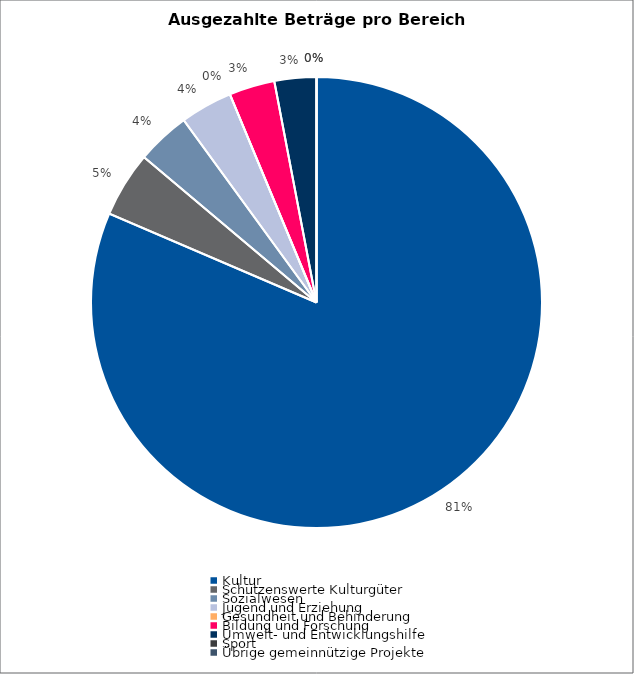
| Category | Series 0 |
|---|---|
| Kultur | 1098194 |
| Schützenswerte Kulturgüter | 63302 |
| Sozialwesen | 51773 |
| Jugend und Erziehung | 50499 |
| Gesundheit und Behinderung | 0 |
| Bildung und Forschung | 44096 |
| Umwelt- und Entwicklungshilfe | 40500 |
| Sport | 0 |
| Übrige gemeinnützige Projekte | 0 |